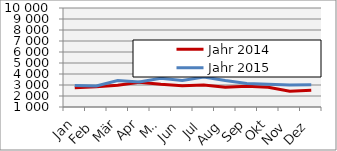
| Category | Jahr 2014 | Jahr 2015 |
|---|---|---|
| 0 | 2744.426 | 2964.487 |
| 1 | 2838.342 | 2906.398 |
| 2 | 2982.277 | 3398.603 |
| 3 | 3247.486 | 3281.118 |
| 4 | 3062.987 | 3601.92 |
| 5 | 2942.185 | 3416.467 |
| 6 | 3010.112 | 3730.283 |
| 7 | 2795.743 | 3406.013 |
| 8 | 2892.781 | 3146.308 |
| 9 | 2796.169 | 3079.007 |
| 10 | 2424.697 | 2990.509 |
| 11 | 2524.315 | 3020.154 |